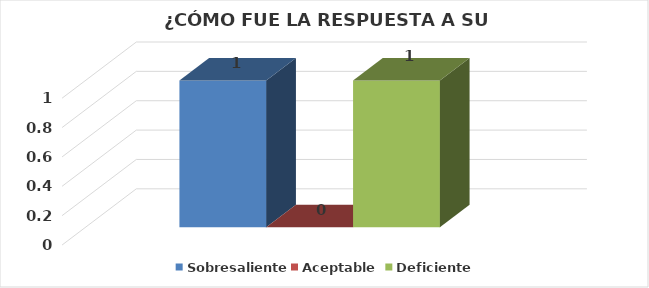
| Category | Sobresaliente | Aceptable  | Deficiente |
|---|---|---|---|
| 0 | 1 | 0 | 1 |